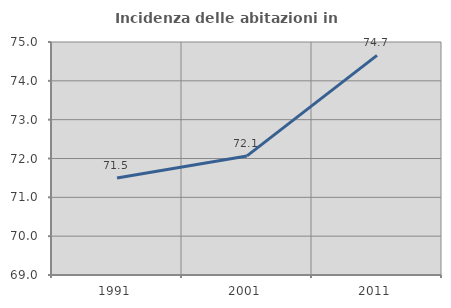
| Category | Incidenza delle abitazioni in proprietà  |
|---|---|
| 1991.0 | 71.496 |
| 2001.0 | 72.066 |
| 2011.0 | 74.655 |